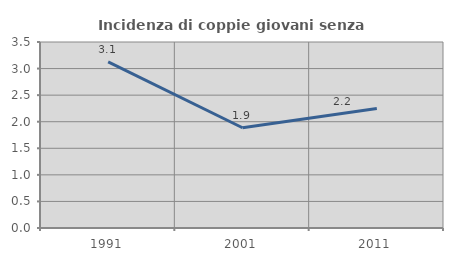
| Category | Incidenza di coppie giovani senza figli |
|---|---|
| 1991.0 | 3.125 |
| 2001.0 | 1.887 |
| 2011.0 | 2.247 |